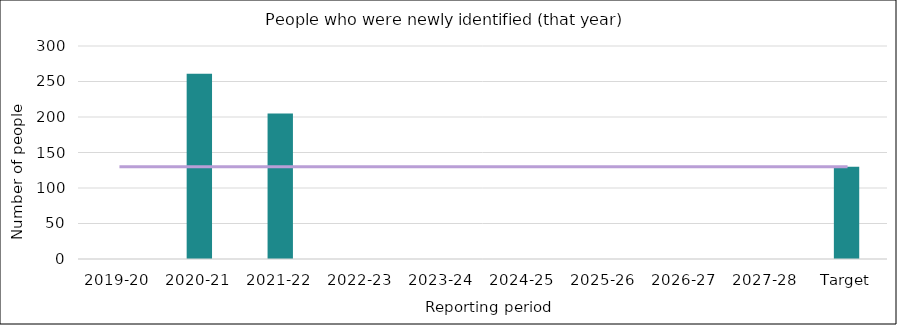
| Category | Series 0 |
|---|---|
| 2019-20 | 0 |
| 2020-21 | 261 |
| 2021-22 | 205 |
| 2022-23 | 0 |
| 2023-24 | 0 |
| 2024-25 | 0 |
| 2025-26 | 0 |
| 2026-27 | 0 |
| 2027-28 | 0 |
| Target | 130 |